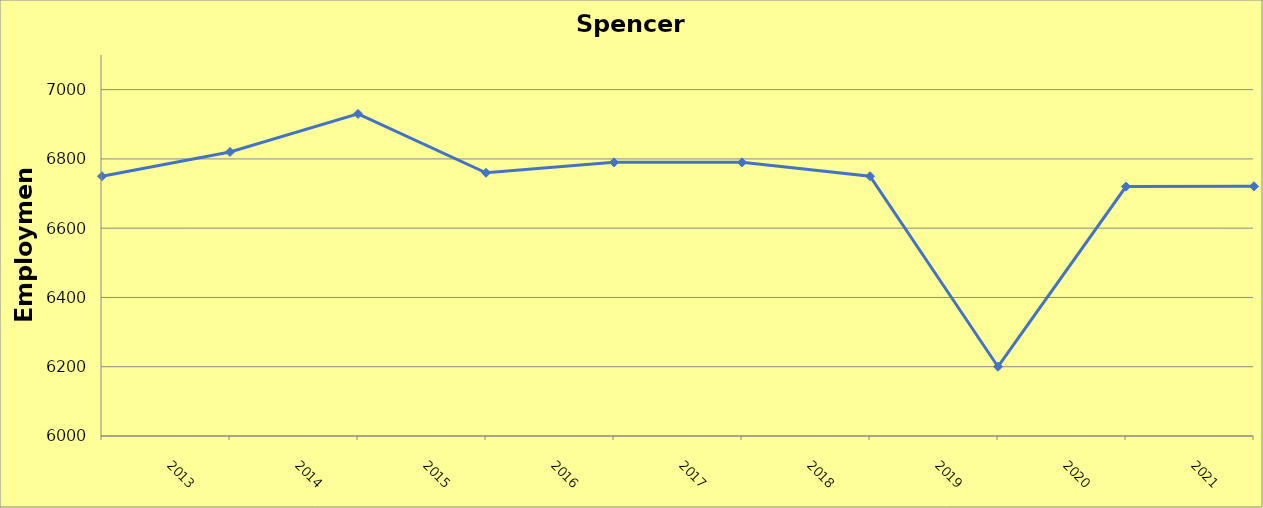
| Category | Spencer County |
|---|---|
| 2013.0 | 6750 |
| 2014.0 | 6820 |
| 2015.0 | 6930 |
| 2016.0 | 6760 |
| 2017.0 | 6790 |
| 2018.0 | 6790 |
| 2019.0 | 6750 |
| 2020.0 | 6200 |
| 2021.0 | 6720 |
| 2022.0 | 6721 |